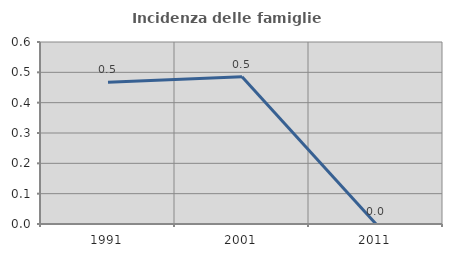
| Category | Incidenza delle famiglie numerose |
|---|---|
| 1991.0 | 0.467 |
| 2001.0 | 0.485 |
| 2011.0 | 0 |